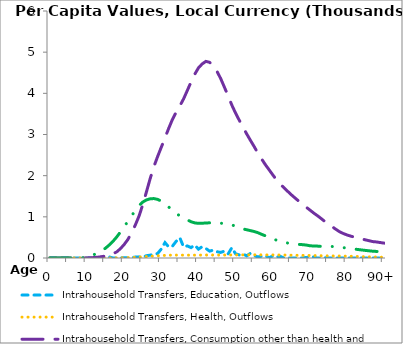
| Category | Intrahousehold Transfers, Education, Outflows | Intrahousehold Transfers, Health, Outflows | Intrahousehold Transfers, Consumption other than health and education, Outflows | Intrahousehold Transfers, Saving, Outflows |
|---|---|---|---|---|
| 0 | 0 | 0 | 0 | 0 |
|  | 0 | 0 | 0 | 0 |
| 2 | 0 | 0 | 0 | 0 |
| 3 | 0 | 0 | 0 | 0 |
| 4 | 0 | 0 | 0 | 0 |
| 5 | 0 | 0 | 0 | 0 |
| 6 | 0 | 0 | 0 | 0 |
| 7 | 0 | 0 | 0.015 | 0.154 |
| 8 | 0 | 0.001 | 0.114 | 1.198 |
| 9 | 0 | 0.008 | 0.652 | 7.17 |
| 10 | 0 | 0.027 | 2.308 | 28.822 |
| 11 | 0 | 0.101 | 6.157 | 60.938 |
| 12 | 0 | 0.237 | 10.828 | 87.629 |
| 13 | 0 | 0.492 | 20.042 | 130.267 |
| 14 | 0 | 0.787 | 33.839 | 183.123 |
| 15 | 0 | 1.088 | 46.746 | 238.994 |
| 16 | 24.561 | 1.59 | 68.014 | 317.338 |
| 17 | 0 | 2.258 | 102.619 | 405.84 |
| 18 | 0 | 3.196 | 148.259 | 510.573 |
| 19 | 4.145 | 4.486 | 227.066 | 630.776 |
| 20 | 6.025 | 6.155 | 327.11 | 759.33 |
| 21 | 2.429 | 8.549 | 449.738 | 890.007 |
| 22 | 10.66 | 11.946 | 610.045 | 1023.892 |
| 23 | 22.306 | 16.169 | 799.447 | 1153.232 |
| 24 | 27.564 | 21.151 | 1017.257 | 1273.817 |
| 25 | 16.483 | 27.585 | 1292.306 | 1358.565 |
| 26 | 55.979 | 34.873 | 1605.62 | 1410.726 |
| 27 | 69.1 | 42.2 | 1926.437 | 1437.821 |
| 28 | 90.583 | 48.877 | 2216.989 | 1443.843 |
| 29 | 107.39 | 54.454 | 2462.082 | 1424.283 |
| 30 | 218.716 | 59.457 | 2690.495 | 1380.856 |
| 31 | 374.661 | 64.227 | 2918.348 | 1316.094 |
| 32 | 266.955 | 67.917 | 3150.247 | 1238.419 |
| 33 | 287.1 | 69.917 | 3365.889 | 1158.73 |
| 34 | 404.838 | 70.559 | 3542.964 | 1084.062 |
| 35 | 490.943 | 69.909 | 3695.008 | 1022.653 |
| 36 | 268.064 | 69.42 | 3864.825 | 974.226 |
| 37 | 293.759 | 69.575 | 4067.73 | 926.358 |
| 38 | 252.797 | 69.498 | 4272.56 | 882.233 |
| 39 | 314.743 | 69.607 | 4462.779 | 852.847 |
| 40 | 214.809 | 70.384 | 4617.321 | 842.259 |
| 41 | 272.952 | 71.217 | 4713.869 | 844.073 |
| 42 | 231.979 | 72.22 | 4776.172 | 850.94 |
| 43 | 167.185 | 72.597 | 4754.016 | 854.357 |
| 44 | 190.763 | 71.925 | 4662.859 | 851.703 |
| 45 | 152.535 | 71.41 | 4534.068 | 847.732 |
| 46 | 135.457 | 71.515 | 4357.211 | 844.447 |
| 47 | 166.764 | 72.17 | 4148.056 | 839.033 |
| 48 | 100.71 | 73.657 | 3934.654 | 825.697 |
| 49 | 250.022 | 74.257 | 3713.314 | 802.373 |
| 50 | 101.963 | 74.525 | 3519.488 | 776.252 |
| 51 | 74.475 | 75.103 | 3345.254 | 743.878 |
| 52 | 95.487 | 75.904 | 3175.817 | 705.946 |
| 53 | 53.26 | 76.423 | 3013.535 | 686.334 |
| 54 | 113.228 | 77.012 | 2858.338 | 664.997 |
| 55 | 57.759 | 77.096 | 2708.003 | 643.859 |
| 56 | 26.587 | 76.977 | 2547.797 | 615.068 |
| 57 | 41.572 | 76.333 | 2407.16 | 575.753 |
| 58 | 56.758 | 75.736 | 2269.741 | 539.649 |
| 59 | 7.049 | 75.43 | 2146.455 | 499.878 |
| 60 | 46.779 | 74.677 | 2020.906 | 465.301 |
| 61 | 17.763 | 73.659 | 1899.986 | 433.462 |
| 62 | 40.519 | 72.515 | 1797.888 | 407.064 |
| 63 | 1.228 | 71.431 | 1708.978 | 383.084 |
| 64 | 1.92 | 69.719 | 1621.889 | 365.292 |
| 65 | 2.383 | 67.808 | 1537.047 | 349.566 |
| 66 | 0.533 | 66.258 | 1458.877 | 340.454 |
| 67 | 8.694 | 64.758 | 1381.189 | 331.549 |
| 68 | 0.245 | 63.503 | 1302.775 | 324.111 |
| 69 | 14.829 | 62.588 | 1235.688 | 315.392 |
| 70 | 16.251 | 60.946 | 1165.941 | 297.799 |
| 71 | 24.037 | 59.429 | 1094.857 | 291.583 |
| 72 | 0.476 | 58.012 | 1030.269 | 289.043 |
| 73 | 1.37 | 55.417 | 961.068 | 282.334 |
| 74 | 5.283 | 52.849 | 889.279 | 282.952 |
| 75 | 2.814 | 51.85 | 824.753 | 282.524 |
| 76 | 0.465 | 50.556 | 760.073 | 279.149 |
| 77 | 0 | 49.405 | 696.962 | 272.236 |
| 78 | 1.174 | 48.208 | 638.453 | 262.348 |
| 79 | 0.288 | 46.265 | 594.832 | 251.944 |
| 80 | 0.029 | 44.046 | 560.204 | 240.966 |
| 81 | 2.595 | 41.59 | 531.094 | 228.905 |
| 82 | 0.998 | 39.081 | 507.305 | 217.531 |
| 83 | 0 | 36.175 | 483.927 | 205.664 |
| 84 | 0 | 33.511 | 462.097 | 194.601 |
| 85 | 0.056 | 30.798 | 440.063 | 183.895 |
| 86 | 0 | 28.085 | 418.554 | 173.801 |
| 87 | 0 | 25.38 | 397.908 | 164.266 |
| 88 | 0.446 | 22.012 | 389.373 | 159.418 |
| 89 | 0 | 19.316 | 374.917 | 151.972 |
| 90+ | 0 | 16.716 | 361.17 | 144.525 |